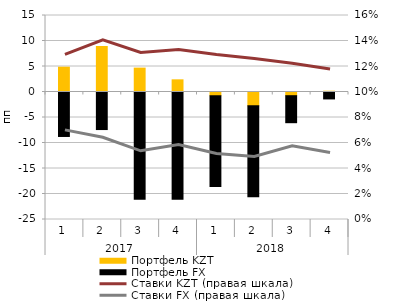
| Category | Портфель KZT | Портфель FX |
|---|---|---|
| 0 | 4.863 | -8.719 |
| 1 | 8.921 | -7.364 |
| 2 | 4.683 | -21.012 |
| 3 | 2.386 | -21.008 |
| 4 | -0.727 | -17.797 |
| 5 | -2.707 | -17.81 |
| 6 | -0.724 | -5.295 |
| 7 | 0.153 | -1.359 |